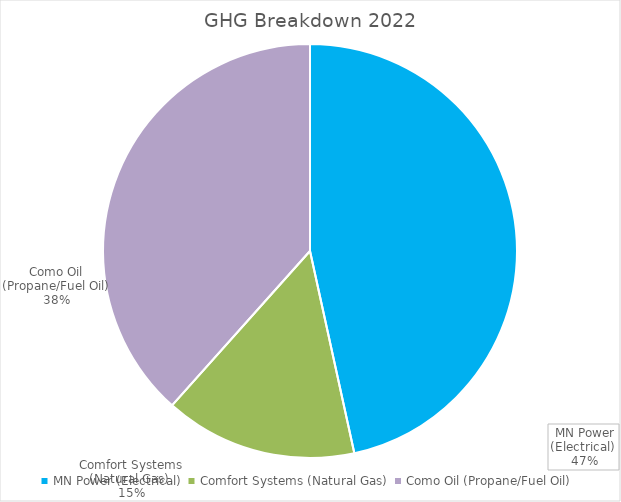
| Category | MN Power (Electrical)  |
|---|---|
| MN Power (Electrical)  | 510.813 |
| Comfort Systems (Natural Gas)  | 165.037 |
| Como Oil (Propane/Fuel Oil) | 421.202 |